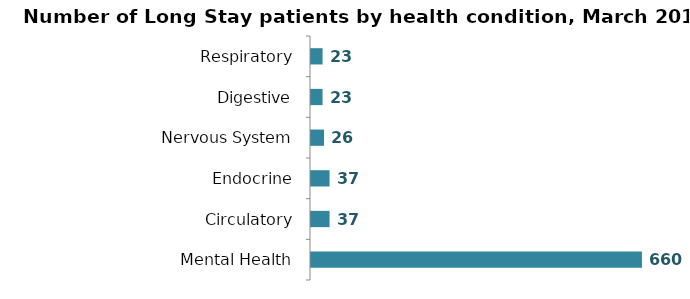
| Category | Series 0 |
|---|---|
| Mental Health | 660 |
| Circulatory | 37 |
| Endocrine | 37 |
| Nervous System | 26 |
| Digestive | 23 |
| Respiratory | 23 |